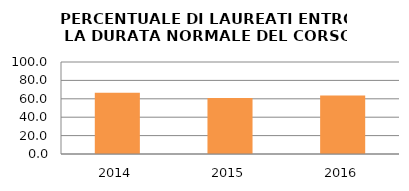
| Category | 2014 2015 2016 |
|---|---|
| 2014.0 | 66.667 |
| 2015.0 | 60.87 |
| 2016.0 | 63.636 |